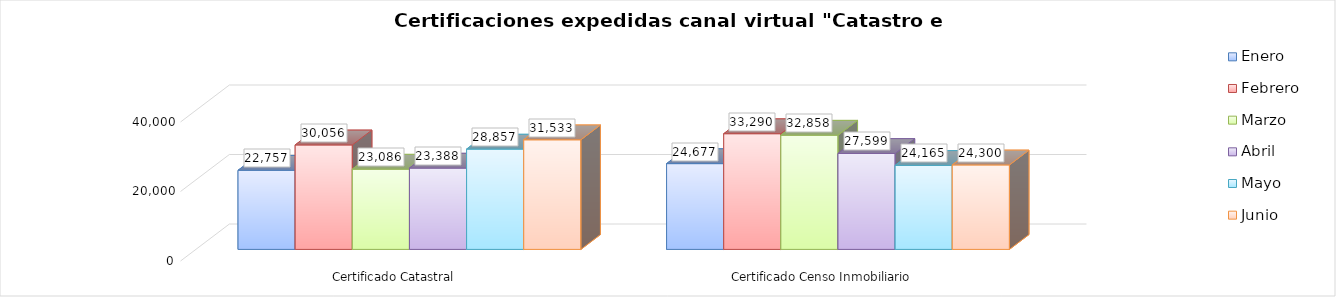
| Category | Enero | Febrero | Marzo | Abril | Mayo | Junio |
|---|---|---|---|---|---|---|
| Certificado Catastral | 22757 | 30056 | 23086 | 23388 | 28857 | 31533 |
| Certificado Censo Inmobiliario | 24677 | 33290 | 32858 | 27599 | 24165 | 24300 |